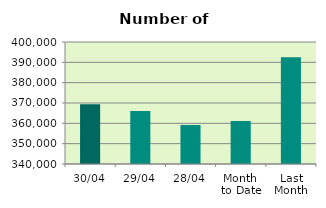
| Category | Series 0 |
|---|---|
| 30/04 | 369376 |
| 29/04 | 366066 |
| 28/04 | 359204 |
| Month 
to Date | 361123.368 |
| Last
Month | 392496.174 |